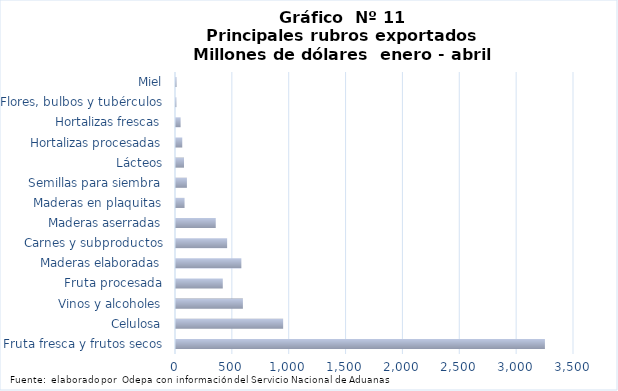
| Category | Series 7 |
|---|---|
| Fruta fresca y frutos secos | 3244233.459 |
| Celulosa | 942323.423 |
| Vinos y alcoholes | 588341.02 |
| Fruta procesada | 411414.11 |
| Maderas elaboradas | 574749.915 |
| Carnes y subproductos | 449650.227 |
| Maderas aserradas | 349492.708 |
| Maderas en plaquitas | 75232.586 |
| Semillas para siembra | 95954.416 |
| Lácteos | 70422.41 |
| Hortalizas procesadas | 55022.197 |
| Hortalizas frescas | 40536.364 |
| Flores, bulbos y tubérculos | 3452.606 |
| Miel | 4828.844 |